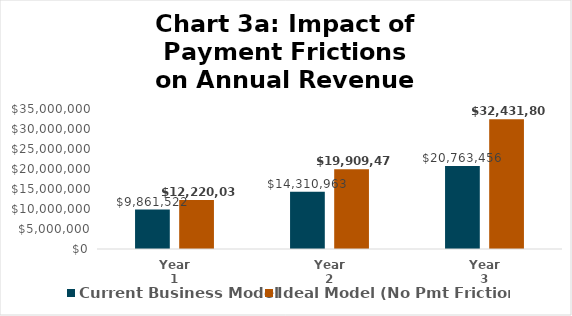
| Category | Current Business Model | Ideal Model (No Pmt Frictions) |
|---|---|---|
| Year 1 | 9861521.577 | 12220038.29 |
| Year 2 | 14310962.641 | 19909477.441 |
| Year 3 | 20763455.704 | 32431807.439 |